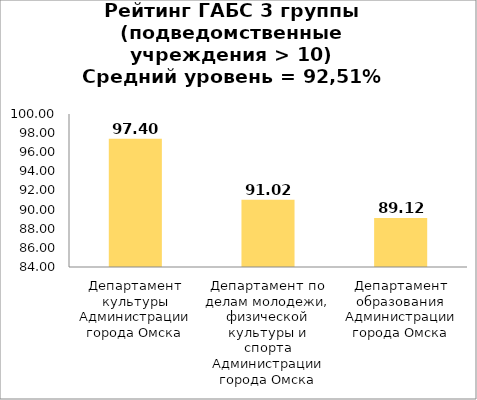
| Category | Series 0 |
|---|---|
| Департамент культуры Администрации города Омска | 97.401 |
| Департамент по делам молодежи, физической культуры и спорта Администрации города Омска | 91.023 |
| Департамент образования Администрации города Омска | 89.117 |